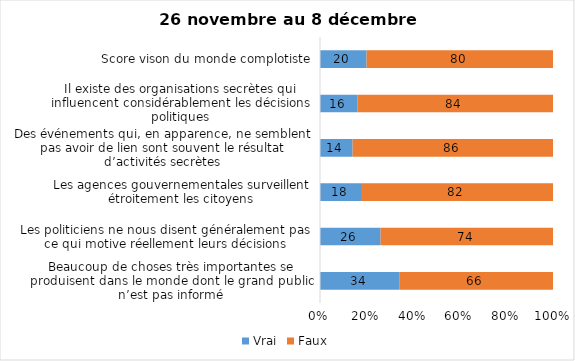
| Category | Vrai | Faux |
|---|---|---|
| Beaucoup de choses très importantes se produisent dans le monde dont le grand public n’est pas informé | 34 | 66 |
| Les politiciens ne nous disent généralement pas ce qui motive réellement leurs décisions | 26 | 74 |
| Les agences gouvernementales surveillent étroitement les citoyens | 18 | 82 |
| Des événements qui, en apparence, ne semblent pas avoir de lien sont souvent le résultat d’activités secrètes | 14 | 86 |
| Il existe des organisations secrètes qui influencent considérablement les décisions politiques | 16 | 84 |
| Score vison du monde complotiste | 20 | 80 |